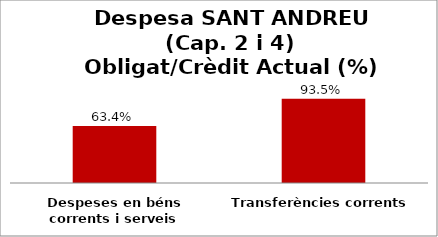
| Category | Series 0 |
|---|---|
| Despeses en béns corrents i serveis | 0.634 |
| Transferències corrents | 0.935 |